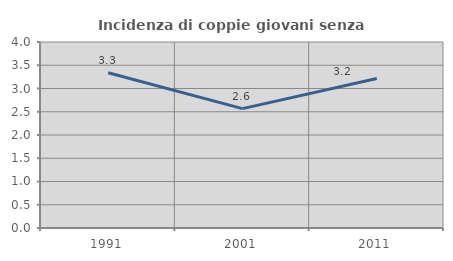
| Category | Incidenza di coppie giovani senza figli |
|---|---|
| 1991.0 | 3.339 |
| 2001.0 | 2.566 |
| 2011.0 | 3.217 |